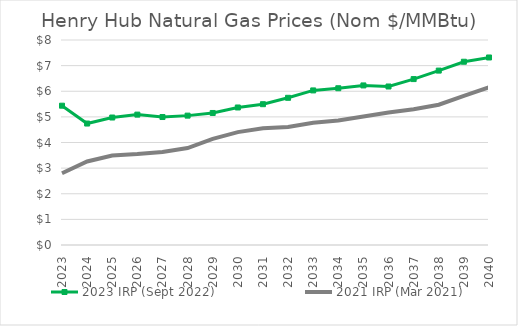
| Category | 2023 IRP (Sept 2022) | 2021 IRP (Mar 2021) |
|---|---|---|
| 2023.0 | 5.436 | 2.802 |
| 2024.0 | 4.74 | 3.259 |
| 2025.0 | 4.975 | 3.489 |
| 2026.0 | 5.088 | 3.547 |
| 2027.0 | 4.994 | 3.63 |
| 2028.0 | 5.049 | 3.782 |
| 2029.0 | 5.152 | 4.142 |
| 2030.0 | 5.367 | 4.406 |
| 2031.0 | 5.495 | 4.554 |
| 2032.0 | 5.744 | 4.601 |
| 2033.0 | 6.033 | 4.773 |
| 2034.0 | 6.117 | 4.855 |
| 2035.0 | 6.227 | 5.018 |
| 2036.0 | 6.186 | 5.174 |
| 2037.0 | 6.475 | 5.301 |
| 2038.0 | 6.806 | 5.476 |
| 2039.0 | 7.151 | 5.816 |
| 2040.0 | 7.318 | 6.157 |